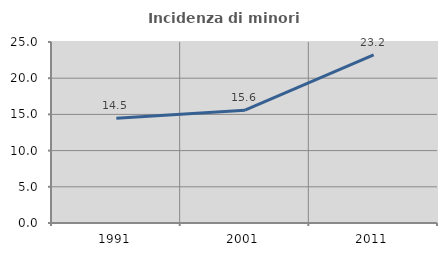
| Category | Incidenza di minori stranieri |
|---|---|
| 1991.0 | 14.483 |
| 2001.0 | 15.574 |
| 2011.0 | 23.222 |